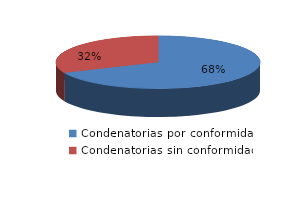
| Category | Series 0 |
|---|---|
| 0 | 136 |
| 1 | 63 |